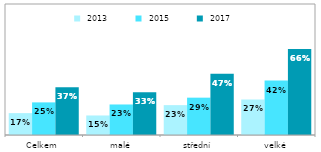
| Category |  2013 |  2015 |  2017 |
|---|---|---|---|
| Celkem | 0.167 | 0.249 | 0.365 |
| malé | 0.149 | 0.233 | 0.327 |
| střední | 0.228 | 0.285 | 0.468 |
| velké | 0.271 | 0.416 | 0.656 |